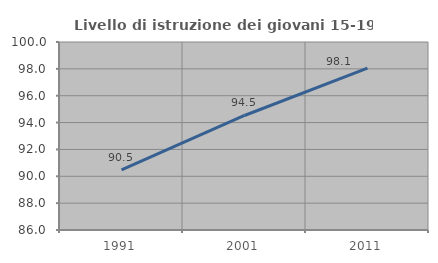
| Category | Livello di istruzione dei giovani 15-19 anni |
|---|---|
| 1991.0 | 90.476 |
| 2001.0 | 94.527 |
| 2011.0 | 98.052 |